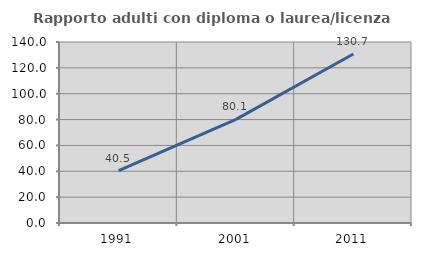
| Category | Rapporto adulti con diploma o laurea/licenza media  |
|---|---|
| 1991.0 | 40.517 |
| 2001.0 | 80.128 |
| 2011.0 | 130.675 |